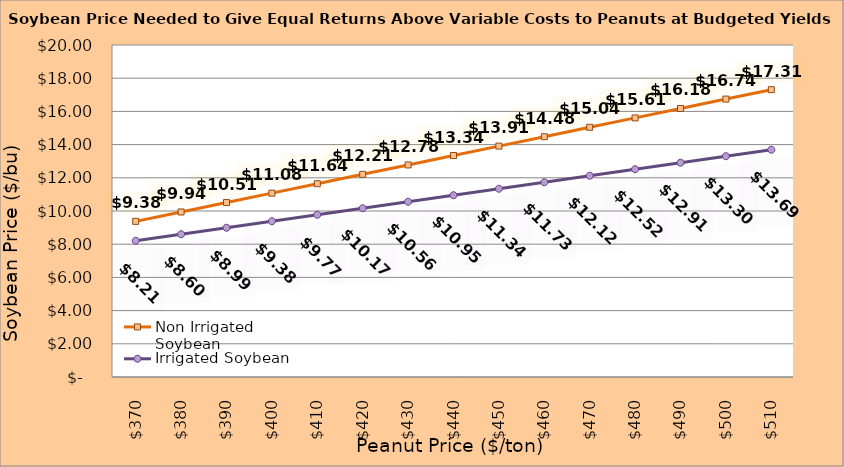
| Category | Non Irrigated Soybean | Irrigated Soybean |
|---|---|---|
| 370.0 | 9.375 | 8.208 |
| 380.0 | 9.942 | 8.599 |
| 390.0 | 10.508 | 8.991 |
| 400.0 | 11.075 | 9.383 |
| 410.0 | 11.642 | 9.774 |
| 420.0 | 12.208 | 10.166 |
| 430.0 | 12.775 | 10.558 |
| 440.0 | 13.342 | 10.949 |
| 450.0 | 13.908 | 11.341 |
| 460.0 | 14.475 | 11.733 |
| 470.0 | 15.042 | 12.124 |
| 480.0 | 15.608 | 12.516 |
| 490.0 | 16.175 | 12.908 |
| 500.0 | 16.742 | 13.299 |
| 510.0 | 17.308 | 13.691 |